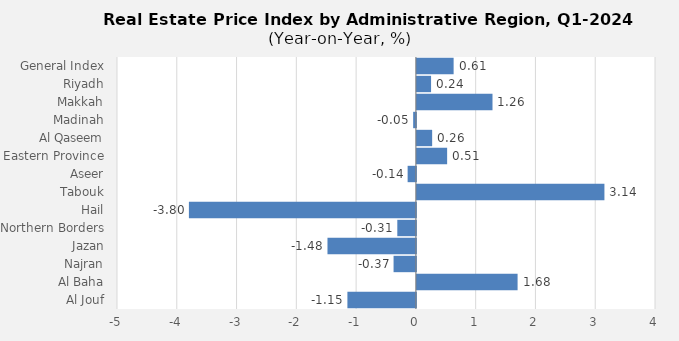
| Category | 2024 |
|---|---|
| General Index | 0.615 |
| Riyadh | 0.237 |
| Makkah | 1.265 |
| Madinah | -0.046 |
| Al Qaseem | 0.255 |
| Eastern Province | 0.506 |
| Aseer | -0.138 |
| Tabouk | 3.137 |
| Hail | -3.797 |
| Northern Borders | -0.311 |
| Jazan | -1.479 |
| Najran | -0.373 |
| Al Baha | 1.685 |
| Al Jouf | -1.146 |